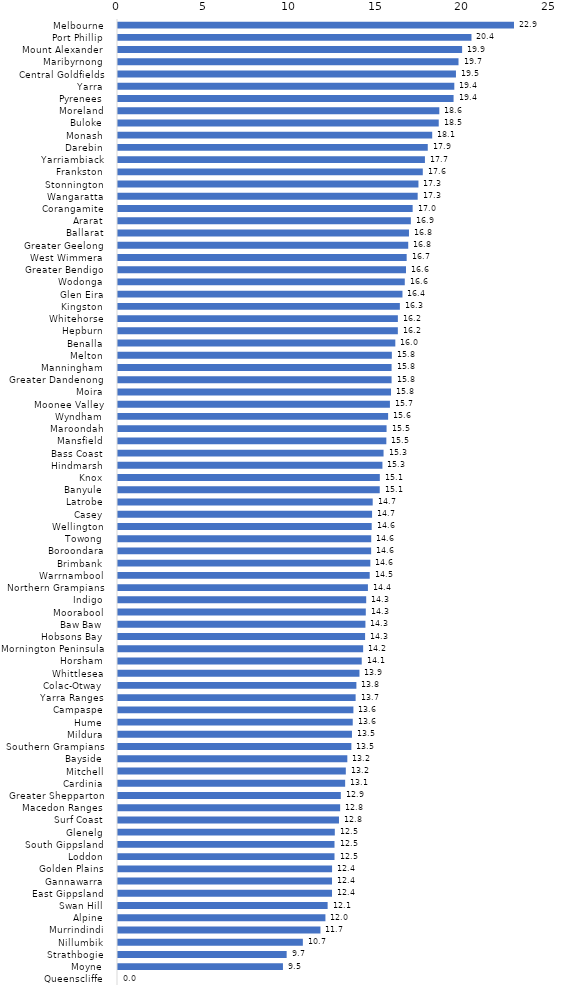
| Category | Series 0 |
|---|---|
| Melbourne  | 22.863 |
| Port Phillip  | 20.408 |
| Mount Alexander  | 19.868 |
| Maribyrnong  | 19.66 |
| Central Goldfields  | 19.512 |
| Yarra  | 19.417 |
| Pyrenees  | 19.375 |
| Moreland  | 18.552 |
| Buloke  | 18.519 |
| Monash  | 18.141 |
| Darebin  | 17.885 |
| Yarriambiack  | 17.722 |
| Frankston  | 17.598 |
| Stonnington  | 17.347 |
| Wangaratta  | 17.302 |
| Corangamite  | 17.012 |
| Ararat  | 16.908 |
| Ballarat  | 16.8 |
| Greater Geelong  | 16.757 |
| West Wimmera  | 16.667 |
| Greater Bendigo  | 16.628 |
| Wodonga  | 16.558 |
| Glen Eira  | 16.424 |
| Kingston  | 16.274 |
| Whitehorse  | 16.159 |
| Hepburn  | 16.157 |
| Benalla  | 16.011 |
| Melton  | 15.811 |
| Manningham  | 15.796 |
| Greater Dandenong  | 15.796 |
| Moira  | 15.764 |
| Moonee Valley  | 15.7 |
| Wyndham  | 15.596 |
| Maroondah  | 15.506 |
| Mansfield  | 15.493 |
| Bass Coast  | 15.332 |
| Hindmarsh  | 15.267 |
| Knox  | 15.116 |
| Banyule  | 15.112 |
| Latrobe  | 14.706 |
| Casey  | 14.669 |
| Wellington  | 14.648 |
| Towong  | 14.62 |
| Boroondara  | 14.615 |
| Brimbank  | 14.57 |
| Warrnambool  | 14.533 |
| Northern Grampians  | 14.43 |
| Indigo  | 14.33 |
| Moorabool  | 14.307 |
| Baw Baw  | 14.286 |
| Hobsons Bay  | 14.266 |
| Mornington Peninsula  | 14.154 |
| Horsham  | 14.072 |
| Whittlesea  | 13.941 |
| Colac-Otway  | 13.764 |
| Yarra Ranges  | 13.72 |
| Campaspe  | 13.592 |
| Hume  | 13.553 |
| Mildura  | 13.508 |
| Southern Grampians  | 13.474 |
| Bayside  | 13.24 |
| Mitchell  | 13.154 |
| Cardinia  | 13.115 |
| Greater Shepparton  | 12.864 |
| Macedon Ranges  | 12.825 |
| Surf Coast  | 12.759 |
| Glenelg  | 12.518 |
| South Gippsland  | 12.5 |
| Loddon  | 12.5 |
| Golden Plains  | 12.36 |
| Gannawarra  | 12.356 |
| East Gippsland  | 12.356 |
| Swan Hill  | 12.103 |
| Alpine  | 11.976 |
| Murrindindi  | 11.688 |
| Nillumbik  | 10.673 |
| Strathbogie  | 9.738 |
| Moyne  | 9.524 |
| Queenscliffe  | 0 |